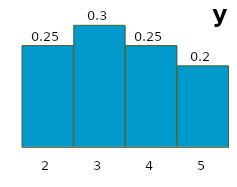
| Category | Series 1 |
|---|---|
| 2.0 | 0.25 |
| 3.0 | 0.3 |
| 4.0 | 0.25 |
| 5.0 | 0.2 |